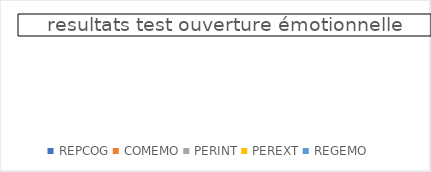
| Category | Series 0 |
|---|---|
| REPCOG | 0 |
| COMEMO | 0 |
| PERINT | 0 |
| PEREXT | 0 |
| REGEMO | 0 |